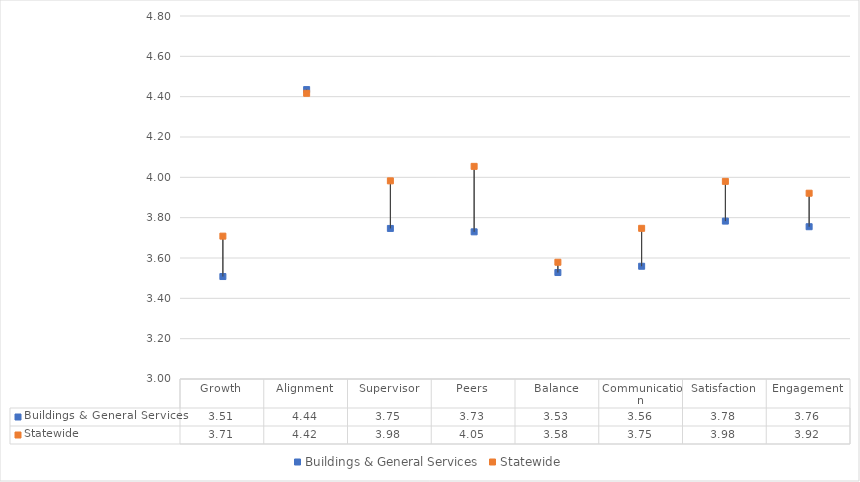
| Category | Buildings & General Services | Statewide |
|---|---|---|
| Growth | 3.508 | 3.708 |
| Alignment | 4.435 | 4.417 |
| Supervisor | 3.747 | 3.983 |
| Peers | 3.73 | 4.054 |
| Balance | 3.528 | 3.579 |
| Communication | 3.559 | 3.747 |
| Satisfaction | 3.783 | 3.98 |
| Engagement | 3.755 | 3.921 |